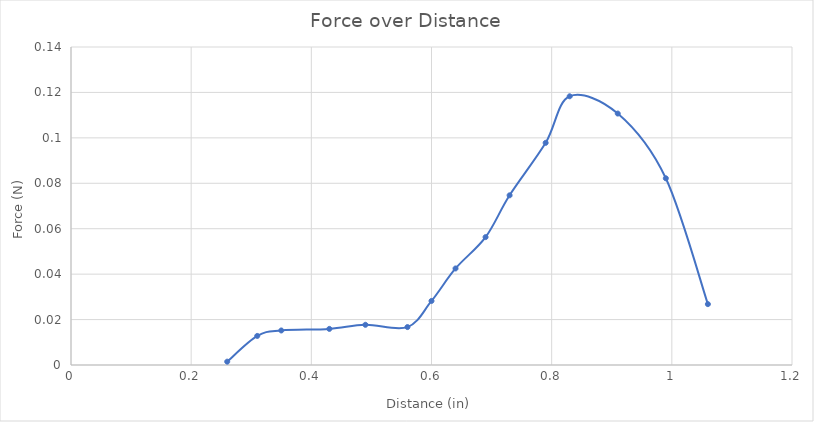
| Category | Force (N) |
|---|---|
| 0.26 | 0.001 |
| 0.31 | 0.013 |
| 0.35 | 0.015 |
| 0.43 | 0.016 |
| 0.49 | 0.018 |
| 0.56 | 0.017 |
| 0.6 | 0.028 |
| 0.64 | 0.042 |
| 0.69 | 0.056 |
| 0.73 | 0.075 |
| 0.79 | 0.098 |
| 0.83 | 0.118 |
| 0.91 | 0.111 |
| 0.99 | 0.082 |
| 1.06 | 0.027 |